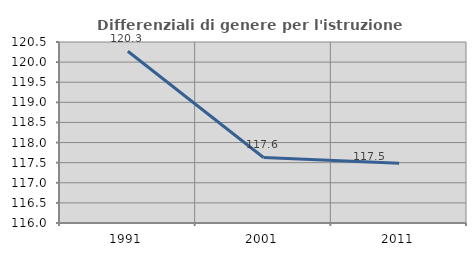
| Category | Differenziali di genere per l'istruzione superiore |
|---|---|
| 1991.0 | 120.27 |
| 2001.0 | 117.629 |
| 2011.0 | 117.483 |